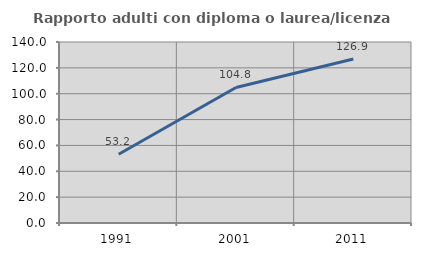
| Category | Rapporto adulti con diploma o laurea/licenza media  |
|---|---|
| 1991.0 | 53.165 |
| 2001.0 | 104.831 |
| 2011.0 | 126.891 |